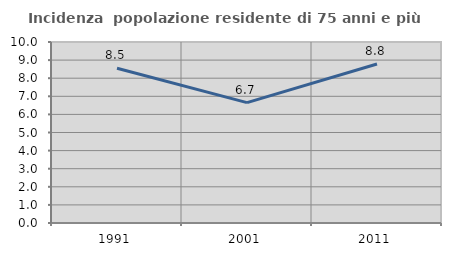
| Category | Incidenza  popolazione residente di 75 anni e più |
|---|---|
| 1991.0 | 8.547 |
| 2001.0 | 6.65 |
| 2011.0 | 8.782 |